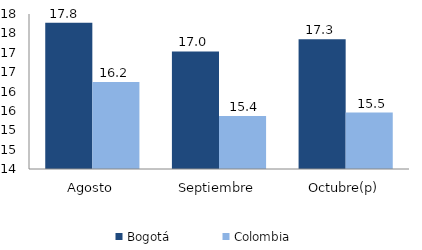
| Category | Bogotá | Colombia |
|---|---|---|
| Agosto | 17.772 | 16.247 |
| Septiembre | 17.033 | 15.37 |
| Octubre(p) | 17.35 | 15.456 |